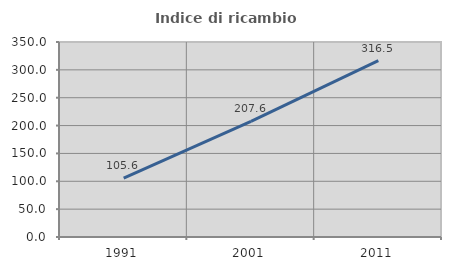
| Category | Indice di ricambio occupazionale  |
|---|---|
| 1991.0 | 105.65 |
| 2001.0 | 207.576 |
| 2011.0 | 316.535 |